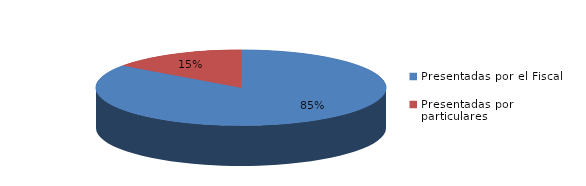
| Category | Series 0 |
|---|---|
| Presentadas por el Fiscal | 731 |
| Presentadas por particulares | 130 |